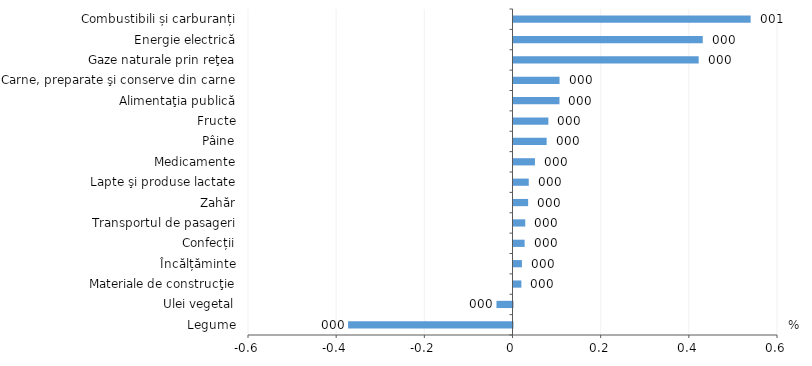
| Category | Series 0 |
|---|---|
| Legume | -0.373 |
| Ulei vegetal | -0.036 |
| Materiale de construcţie | 0.018 |
| Încălțăminte | 0.019 |
| Confecții | 0.025 |
| Transportul de pasageri | 0.027 |
| Zahăr | 0.033 |
| Lapte şi produse lactate | 0.035 |
| Medicamente | 0.049 |
| Pâine | 0.075 |
| Fructe | 0.079 |
| Alimentaţia publică | 0.104 |
| Carne, preparate şi conserve din carne | 0.104 |
|   Gaze naturale prin reţea | 0.42 |
|   Energie electrică | 0.429 |
| Combustibili și carburanți | 0.538 |